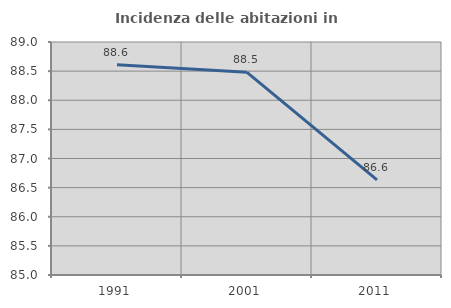
| Category | Incidenza delle abitazioni in proprietà  |
|---|---|
| 1991.0 | 88.608 |
| 2001.0 | 88.479 |
| 2011.0 | 86.632 |